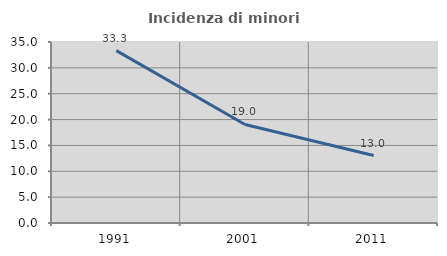
| Category | Incidenza di minori stranieri |
|---|---|
| 1991.0 | 33.333 |
| 2001.0 | 19.048 |
| 2011.0 | 13.043 |